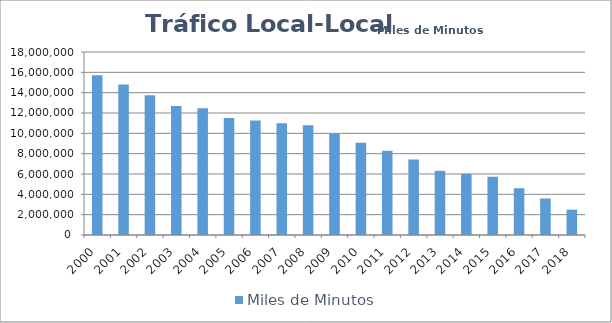
| Category | Miles de Minutos |
|---|---|
| 2000 | 15708021.692 |
| 2001 | 14792112.011 |
| 2002 | 13741512.578 |
| 2003 | 12697840.356 |
| 2004 | 12471681.103 |
| 2005 | 11497364.137 |
| 2006 | 11250082.402 |
| 2007 | 10981107.318 |
| 2008 | 10792163.023 |
| 2009 | 9925576.314 |
| 2010 | 9070767.124 |
| 2011 | 8283065.602 |
| 2012 | 7428037.584 |
| 2013 | 6310456.472 |
| 2014 | 6026527.532 |
| 2015 | 5731826.348 |
| 2016 | 4599625.362 |
| 2017 | 3595888.694 |
| 2018 | 2491113.134 |